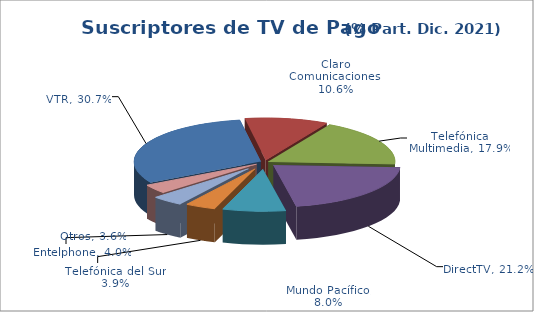
| Category | Series 0 |
|---|---|
| VTR | 0.307 |
| Claro Comunicaciones | 0.106 |
| Telefónica Multimedia | 0.179 |
| DirectTV | 0.212 |
| Mundo Pacífico | 0.08 |
| Telefónica del Sur | 0.039 |
| Entelphone | 0.04 |
| Otros | 0.036 |